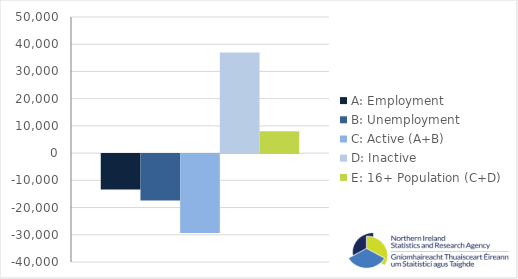
| Category | A: Employment | B: Unemployment | C: Active (A+B) | D: Inactive | E: 16+ Population (C+D) |
|---|---|---|---|---|---|
| 0 | -13000 | -17000 | -29000 | 37000 | 8000 |